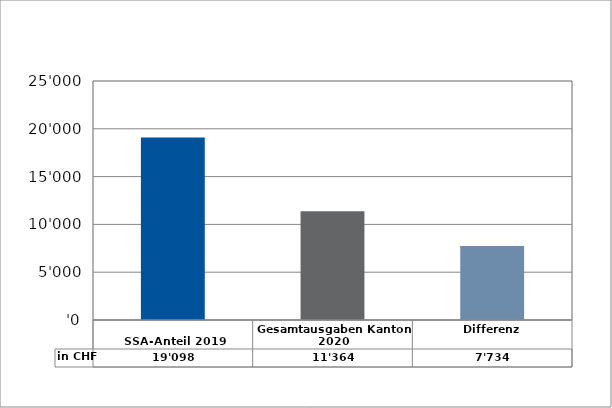
| Category | in CHF |
|---|---|
| 
SSA-Anteil 2019

 | 19098 |
| Gesamtausgaben Kanton 2020
 | 11363.75 |
| Differenz | 7734.25 |